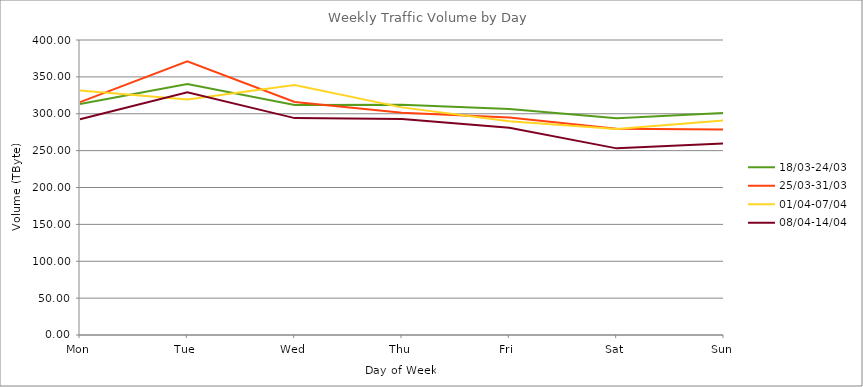
| Category | 18/03-24/03 | 25/03-31/03 | 01/04-07/04 | 08/04-14/04 |
|---|---|---|---|---|
| Mon | 313.24 | 315.77 | 331.69 | 292.53 |
| Tue | 340.36 | 371.03 | 319.4 | 329.01 |
| Wed | 311.81 | 316.06 | 339.08 | 294.08 |
| Thu | 312.13 | 301.44 | 308.63 | 292.98 |
| Fri | 306.47 | 295.01 | 289.98 | 280.87 |
| Sat | 293.92 | 279.66 | 279.4 | 253.07 |
| Sun | 300.92 | 278.65 | 291.12 | 259.8 |